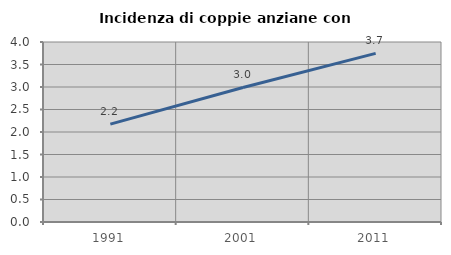
| Category | Incidenza di coppie anziane con figli |
|---|---|
| 1991.0 | 2.174 |
| 2001.0 | 2.989 |
| 2011.0 | 3.746 |